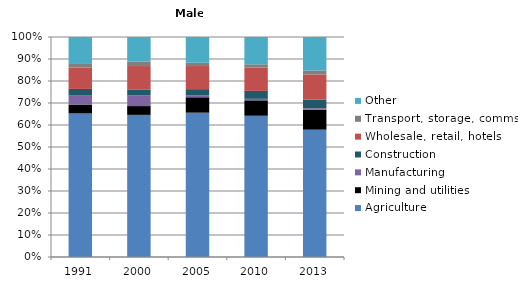
| Category | Agriculture | Mining and utilities | Manufacturing | Construction | Wholesale, retail, hotels | Transport, storage, comms | Other |
|---|---|---|---|---|---|---|---|
| 1991.0 | 65.3 | 4 | 4.3 | 2.8 | 9.7 | 2 | 11.9 |
| 2000.0 | 64.6 | 4 | 4.8 | 2.6 | 10.8 | 2 | 11.2 |
| 2005.0 | 65.6 | 7 | 0.8 | 2.9 | 10.5 | 1.5 | 11.7 |
| 2010.0 | 64.2 | 7 | 0.7 | 3.6 | 10.6 | 1.5 | 12.4 |
| 2013.0 | 57.9 | 9 | 0.7 | 4 | 11.4 | 1.8 | 15.2 |